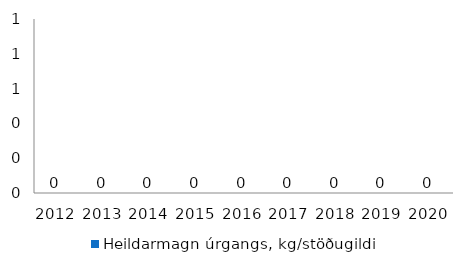
| Category | Heildarmagn úrgangs, kg/stöðugildi |
|---|---|
| 2012.0 | 0 |
| 2013.0 | 0 |
| 2014.0 | 0 |
| 2015.0 | 0 |
| 2016.0 | 0 |
| 2017.0 | 0 |
| 2018.0 | 0 |
| 2019.0 | 0 |
| 2020.0 | 0 |